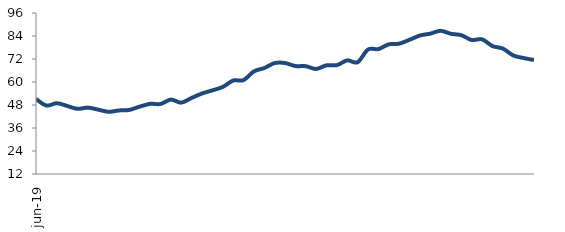
| Category | Series 0 |
|---|---|
| 2019-06-01 | 51.167 |
| 2019-07-01 | 47.705 |
| 2019-08-01 | 48.94 |
| 2019-09-01 | 47.515 |
| 2019-10-01 | 45.989 |
| 2019-11-01 | 46.631 |
| 2019-12-01 | 45.576 |
| 2020-01-01 | 44.444 |
| 2020-02-01 | 45.166 |
| 2020-03-01 | 45.444 |
| 2020-04-01 | 47.162 |
| 2020-05-01 | 48.595 |
| 2020-06-01 | 48.53 |
| 2020-07-01 | 50.83 |
| 2020-08-01 | 49.231 |
| 2020-09-01 | 51.699 |
| 2020-10-01 | 53.991 |
| 2020-11-01 | 55.639 |
| 2020-12-01 | 57.413 |
| 2021-01-01 | 60.742 |
| 2021-02-01 | 60.984 |
| 2021-03-01 | 65.524 |
| 2021-04-01 | 67.28 |
| 2021-05-01 | 69.863 |
| 2021-06-01 | 69.912 |
| 2021-07-01 | 68.331 |
| 2021-08-01 | 68.248 |
| 2021-09-01 | 66.807 |
| 2021-10-01 | 68.707 |
| 2021-11-01 | 68.802 |
| 2021-12-01 | 71.282 |
| 2022-01-01 | 70.309 |
| 2022-02-01 | 76.939 |
| 2022-03-01 | 77.168 |
| 2022-04-01 | 79.628 |
| 2022-05-01 | 79.996 |
| 2022-06-01 | 82.029 |
| 2022-07-01 | 84.239 |
| 2022-08-01 | 85.232 |
| 2022-09-01 | 86.701 |
| 2022-10-01 | 85.146 |
| 2022-11-01 | 84.409 |
| 2022-12-01 | 81.907 |
| 2023-01-01 | 82.272 |
| 2023-02-01 | 78.738 |
| 2023-03-01 | 77.447 |
| 2023-04-01 | 73.856 |
| 2023-05-01 | 72.507 |
| 2023-06-01 | 71.462 |